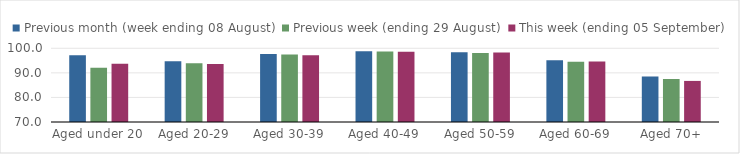
| Category | Previous month (week ending 08 August) | Previous week (ending 29 August) | This week (ending 05 September) |
|---|---|---|---|
| Aged under 20 | 97.21 | 92.07 | 93.67 |
| Aged 20-29 | 94.7 | 93.92 | 93.6 |
| Aged 30-39 | 97.72 | 97.43 | 97.18 |
| Aged 40-49 | 98.81 | 98.73 | 98.61 |
| Aged 50-59 | 98.38 | 98.04 | 98.33 |
| Aged 60-69 | 95.12 | 94.55 | 94.61 |
| Aged 70+ | 88.52 | 87.5 | 86.72 |